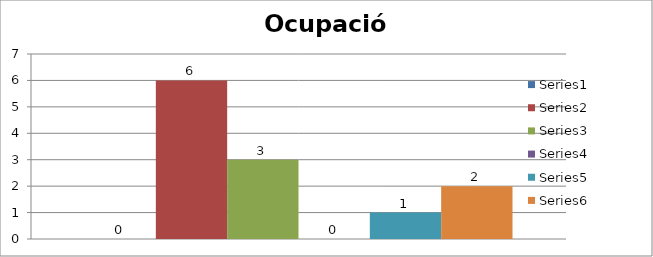
| Category | Series 0 | Series 1 | Series 2 | Series 3 | Series 4 | Series 5 |
|---|---|---|---|---|---|---|
| 0 | 0 | 6 | 3 | 0 | 1 | 2 |